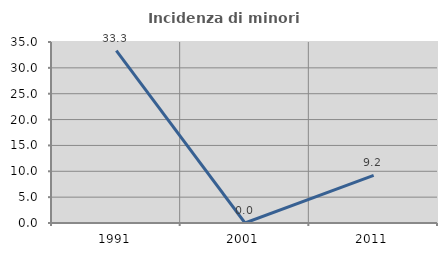
| Category | Incidenza di minori stranieri |
|---|---|
| 1991.0 | 33.333 |
| 2001.0 | 0 |
| 2011.0 | 9.211 |